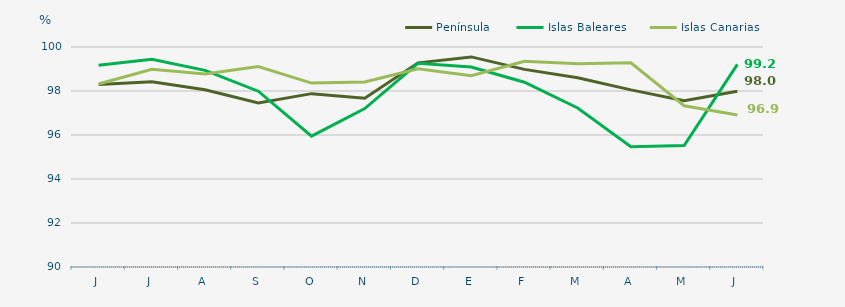
| Category | Península | Islas Baleares | Islas Canarias |
|---|---|---|---|
| J | 98.29 | 99.17 | 98.32 |
| J | 98.42 | 99.44 | 98.99 |
| A | 98.06 | 98.94 | 98.77 |
| S | 97.46 | 97.99 | 99.11 |
| O | 97.88 | 95.95 | 98.36 |
| N | 97.67 | 97.2 | 98.41 |
| D | 99.28 | 99.26 | 99.01 |
| E | 99.55 | 99.09 | 98.69 |
| F | 98.984 | 98.4 | 99.35 |
| M | 98.6 | 97.23 | 99.24 |
| A | 98.05 | 95.47 | 99.28 |
| M | 97.56 | 95.52 | 97.33 |
| J | 97.99 | 99.21 | 96.91 |